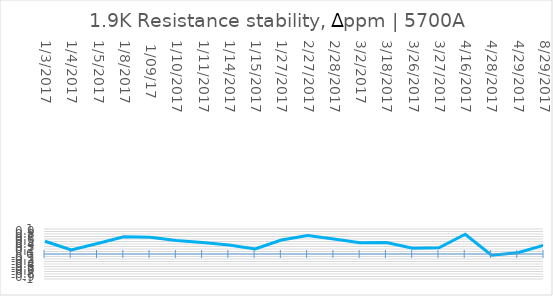
| Category | Series 0 |
|---|---|
| 1/3/2017 | 0.51 |
| 1/4/2017 | 0.16 |
| 1/5/2017 | 0.42 |
| 1/8/2017 | 0.69 |
|  1/09/17 | 0.67 |
| 1/10/2017 | 0.54 |
| 1/11/2017 | 0.46 |
| 1/14/2017 | 0.36 |
| 1/15/2017 | 0.2 |
| 1/27/2017 | 0.56 |
| 2/27/2017 | 0.74 |
| 2/28/2017 | 0.6 |
| 3/2/2017 | 0.45 |
| 3/18/2017 | 0.46 |
| 3/26/2017 | 0.23 |
| 3/27/2017 | 0.25 |
| 4/16/2017 | 0.79 |
| 4/28/2017 | -0.05 |
| 4/29/2017 | 0.05 |
| 8/29/2017 | 0.35 |